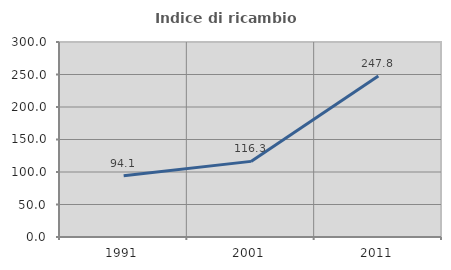
| Category | Indice di ricambio occupazionale  |
|---|---|
| 1991.0 | 94.075 |
| 2001.0 | 116.334 |
| 2011.0 | 247.842 |